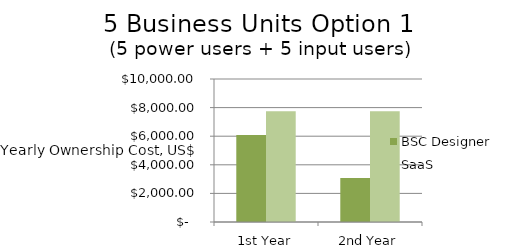
| Category | BSC Designer  | SaaS |
|---|---|---|
| 1st Year | 6080 | 7740 |
| 2nd Year | 3084 | 7740 |